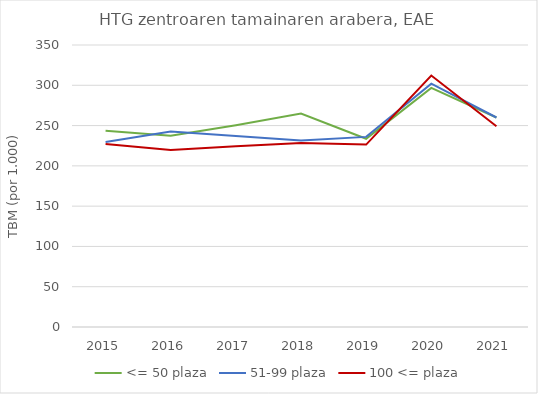
| Category | <= 50 plaza | 51-99 plaza | 100 <= plaza |
|---|---|---|---|
| 2015.0 | 243.642 | 229.712 | 227.18 |
| 2016.0 | 237.512 | 242.745 | 219.71 |
| 2017.0 | 250.306 | 237.196 | 224.196 |
| 2018.0 | 264.885 | 231.383 | 228.477 |
| 2019.0 | 233.583 | 235.962 | 226.395 |
| 2020.0 | 296.73 | 302.064 | 312.145 |
| 2021.0 | 260.035 | 260.012 | 249.166 |